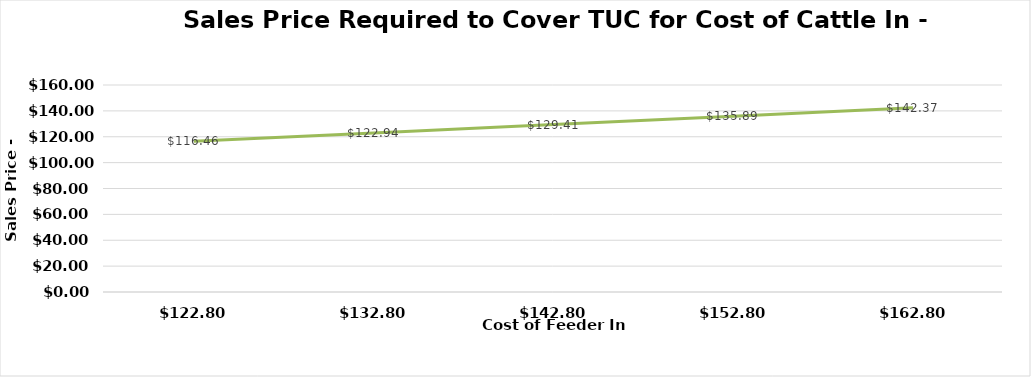
| Category | Sales Price |
|---|---|
| 122.79999999999998 | 116.463 |
| 132.79999999999998 | 122.939 |
| 142.79999999999998 | 129.414 |
| 152.79999999999998 | 135.89 |
| 162.79999999999998 | 142.365 |